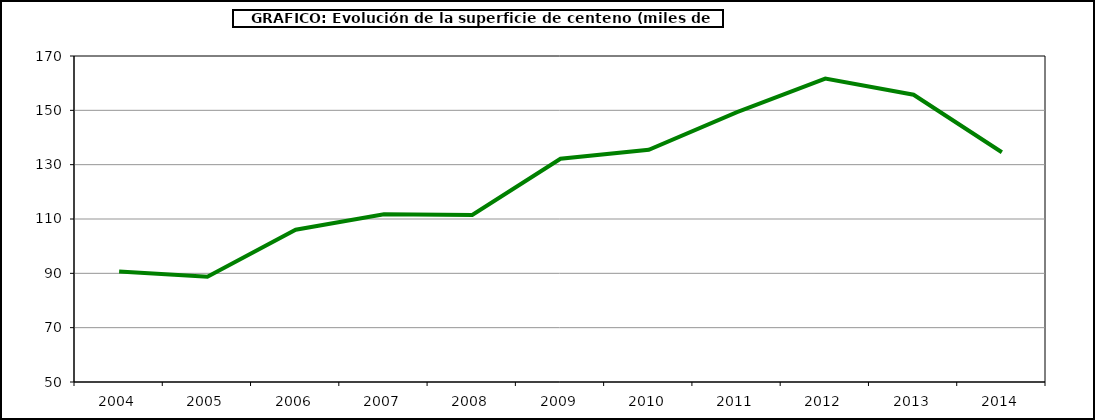
| Category | Superficie |
|---|---|
| 2004.0 | 90.669 |
| 2005.0 | 88.746 |
| 2006.0 | 106.073 |
| 2007.0 | 111.744 |
| 2008.0 | 111.513 |
| 2009.0 | 132.161 |
| 2010.0 | 135.488 |
| 2011.0 | 149.321 |
| 2012.0 | 161.702 |
| 2013.0 | 155.734 |
| 2014.0 | 134.563 |